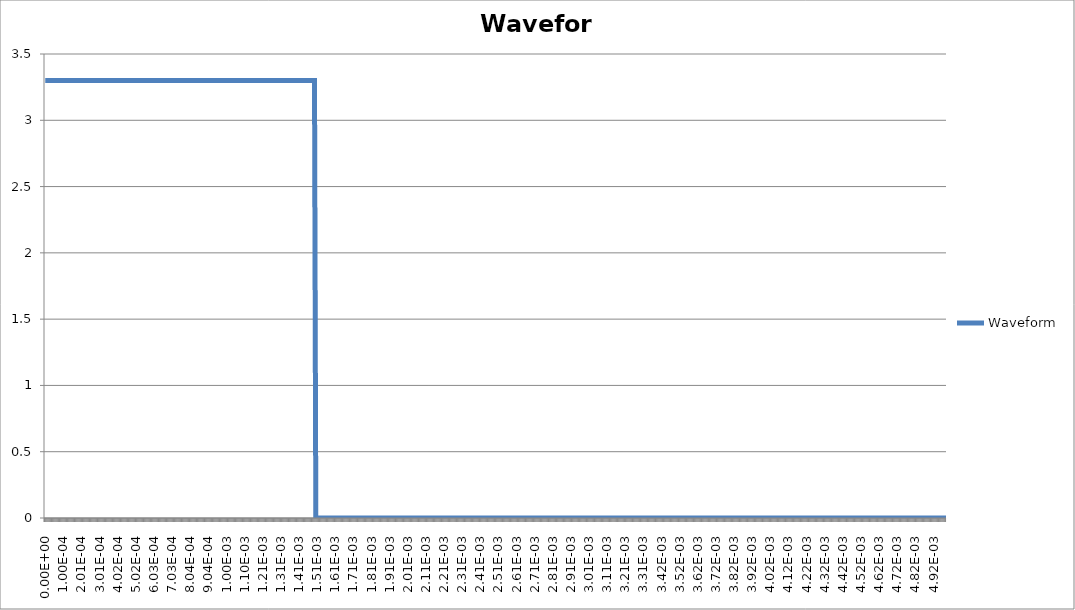
| Category | Waveform |
|---|---|
| 0.0 | 3.3 |
| 2.45e-06 | 3.3 |
| 4.9e-06 | 3.3 |
| 7.35e-06 | 3.3 |
| 9.8e-06 | 3.3 |
| 1.225e-05 | 3.3 |
| 1.47e-05 | 3.3 |
| 1.715e-05 | 3.3 |
| 1.96e-05 | 3.3 |
| 2.205e-05 | 3.3 |
| 2.45e-05 | 3.3 |
| 2.695e-05 | 3.3 |
| 2.94e-05 | 3.3 |
| 3.185e-05 | 3.3 |
| 3.43e-05 | 3.3 |
| 3.675e-05 | 3.3 |
| 3.92e-05 | 3.3 |
| 4.165e-05 | 3.3 |
| 4.41e-05 | 3.3 |
| 4.655e-05 | 3.3 |
| 4.9e-05 | 3.3 |
| 5.145e-05 | 3.3 |
| 5.39e-05 | 3.3 |
| 5.635e-05 | 3.3 |
| 5.88e-05 | 3.3 |
| 6.125e-05 | 3.3 |
| 6.37e-05 | 3.3 |
| 6.615e-05 | 3.3 |
| 6.86e-05 | 3.3 |
| 7.105e-05 | 3.3 |
| 7.35e-05 | 3.3 |
| 7.595e-05 | 3.3 |
| 7.84e-05 | 3.3 |
| 8.085e-05 | 3.3 |
| 8.33e-05 | 3.3 |
| 8.575e-05 | 3.3 |
| 8.82e-05 | 3.3 |
| 9.065e-05 | 3.3 |
| 9.31e-05 | 3.3 |
| 9.555e-05 | 3.3 |
| 9.8e-05 | 3.3 |
| 0.00010045 | 3.3 |
| 0.0001029 | 3.3 |
| 0.00010535 | 3.3 |
| 0.0001078 | 3.3 |
| 0.00011025 | 3.3 |
| 0.0001127 | 3.3 |
| 0.00011515 | 3.3 |
| 0.0001176 | 3.3 |
| 0.00012005 | 3.3 |
| 0.0001225 | 3.3 |
| 0.00012495 | 3.3 |
| 0.0001274 | 3.3 |
| 0.00012985 | 3.3 |
| 0.0001323 | 3.3 |
| 0.00013475 | 3.3 |
| 0.0001372 | 3.3 |
| 0.00013965 | 3.3 |
| 0.0001421 | 3.3 |
| 0.00014455 | 3.3 |
| 0.000147 | 3.3 |
| 0.00014945 | 3.3 |
| 0.0001519 | 3.3 |
| 0.00015435 | 3.3 |
| 0.0001568 | 3.3 |
| 0.00015925 | 3.3 |
| 0.0001617 | 3.3 |
| 0.00016415 | 3.3 |
| 0.0001666 | 3.3 |
| 0.00016905 | 3.3 |
| 0.0001715 | 3.3 |
| 0.00017395 | 3.3 |
| 0.0001764 | 3.3 |
| 0.00017885 | 3.3 |
| 0.0001813 | 3.3 |
| 0.00018375 | 3.3 |
| 0.0001862 | 3.3 |
| 0.00018865 | 3.3 |
| 0.0001911 | 3.3 |
| 0.00019355 | 3.3 |
| 0.000196 | 3.3 |
| 0.00019845 | 3.3 |
| 0.0002009 | 3.3 |
| 0.00020335 | 3.3 |
| 0.0002058 | 3.3 |
| 0.00020825 | 3.3 |
| 0.0002107 | 3.3 |
| 0.00021315 | 3.3 |
| 0.0002156 | 3.3 |
| 0.00021805 | 3.3 |
| 0.0002205 | 3.3 |
| 0.00022295 | 3.3 |
| 0.0002254 | 3.3 |
| 0.00022785 | 3.3 |
| 0.0002303 | 3.3 |
| 0.00023275 | 3.3 |
| 0.0002352 | 3.3 |
| 0.00023765 | 3.3 |
| 0.0002401 | 3.3 |
| 0.00024255 | 3.3 |
| 0.000245 | 3.3 |
| 0.00024745 | 3.3 |
| 0.0002499 | 3.3 |
| 0.00025235 | 3.3 |
| 0.0002548 | 3.3 |
| 0.00025725 | 3.3 |
| 0.0002597 | 3.3 |
| 0.00026215 | 3.3 |
| 0.0002646 | 3.3 |
| 0.00026705 | 3.3 |
| 0.0002695 | 3.3 |
| 0.00027195 | 3.3 |
| 0.0002744 | 3.3 |
| 0.00027685 | 3.3 |
| 0.0002793 | 3.3 |
| 0.00028175 | 3.3 |
| 0.0002842 | 3.3 |
| 0.00028665 | 3.3 |
| 0.0002891 | 3.3 |
| 0.00029155 | 3.3 |
| 0.000294 | 3.3 |
| 0.00029645 | 3.3 |
| 0.0002989 | 3.3 |
| 0.00030135 | 3.3 |
| 0.0003038 | 3.3 |
| 0.00030625 | 3.3 |
| 0.0003087 | 3.3 |
| 0.00031115 | 3.3 |
| 0.0003136 | 3.3 |
| 0.00031605 | 3.3 |
| 0.0003185 | 3.3 |
| 0.00032095 | 3.3 |
| 0.0003234 | 3.3 |
| 0.00032585 | 3.3 |
| 0.0003283 | 3.3 |
| 0.00033075 | 3.3 |
| 0.0003332 | 3.3 |
| 0.00033565 | 3.3 |
| 0.0003381 | 3.3 |
| 0.00034055 | 3.3 |
| 0.000343 | 3.3 |
| 0.00034545 | 3.3 |
| 0.0003479 | 3.3 |
| 0.00035035 | 3.3 |
| 0.0003528 | 3.3 |
| 0.00035525 | 3.3 |
| 0.0003577 | 3.3 |
| 0.00036015 | 3.3 |
| 0.0003626 | 3.3 |
| 0.00036505 | 3.3 |
| 0.0003675 | 3.3 |
| 0.00036995 | 3.3 |
| 0.0003724 | 3.3 |
| 0.00037485 | 3.3 |
| 0.0003773 | 3.3 |
| 0.00037975 | 3.3 |
| 0.0003822 | 3.3 |
| 0.00038465 | 3.3 |
| 0.0003871 | 3.3 |
| 0.00038955 | 3.3 |
| 0.000392 | 3.3 |
| 0.00039445 | 3.3 |
| 0.0003969 | 3.3 |
| 0.00039935 | 3.3 |
| 0.0004018 | 3.3 |
| 0.00040425 | 3.3 |
| 0.0004067 | 3.3 |
| 0.00040915 | 3.3 |
| 0.0004116 | 3.3 |
| 0.00041405 | 3.3 |
| 0.0004165 | 3.3 |
| 0.00041895 | 3.3 |
| 0.0004214 | 3.3 |
| 0.00042385 | 3.3 |
| 0.0004263 | 3.3 |
| 0.00042875 | 3.3 |
| 0.0004312 | 3.3 |
| 0.00043365 | 3.3 |
| 0.0004361 | 3.3 |
| 0.00043855 | 3.3 |
| 0.000441 | 3.3 |
| 0.00044345 | 3.3 |
| 0.0004459 | 3.3 |
| 0.00044835 | 3.3 |
| 0.0004508 | 3.3 |
| 0.00045325 | 3.3 |
| 0.0004557 | 3.3 |
| 0.00045815 | 3.3 |
| 0.0004606 | 3.3 |
| 0.00046305 | 3.3 |
| 0.0004655 | 3.3 |
| 0.00046795 | 3.3 |
| 0.0004704 | 3.3 |
| 0.00047285 | 3.3 |
| 0.0004753 | 3.3 |
| 0.00047775 | 3.3 |
| 0.0004802 | 3.3 |
| 0.00048265 | 3.3 |
| 0.0004851 | 3.3 |
| 0.00048755 | 3.3 |
| 0.00049 | 3.3 |
| 0.00049245 | 3.3 |
| 0.0004949 | 3.3 |
| 0.00049735 | 3.3 |
| 0.0004998 | 3.3 |
| 0.00050225 | 3.3 |
| 0.0005047 | 3.3 |
| 0.00050715 | 3.3 |
| 0.0005096 | 3.3 |
| 0.00051205 | 3.3 |
| 0.0005145 | 3.3 |
| 0.00051695 | 3.3 |
| 0.0005194 | 3.3 |
| 0.00052185 | 3.3 |
| 0.0005243 | 3.3 |
| 0.00052675 | 3.3 |
| 0.0005292 | 3.3 |
| 0.00053165 | 3.3 |
| 0.0005341 | 3.3 |
| 0.00053655 | 3.3 |
| 0.000539 | 3.3 |
| 0.00054145 | 3.3 |
| 0.0005439 | 3.3 |
| 0.00054635 | 3.3 |
| 0.0005488 | 3.3 |
| 0.00055125 | 3.3 |
| 0.0005537 | 3.3 |
| 0.00055615 | 3.3 |
| 0.0005586 | 3.3 |
| 0.00056105 | 3.3 |
| 0.0005635 | 3.3 |
| 0.00056595 | 3.3 |
| 0.0005684 | 3.3 |
| 0.00057085 | 3.3 |
| 0.0005733 | 3.3 |
| 0.00057575 | 3.3 |
| 0.0005782 | 3.3 |
| 0.00058065 | 3.3 |
| 0.0005831 | 3.3 |
| 0.00058555 | 3.3 |
| 0.000588 | 3.3 |
| 0.00059045 | 3.3 |
| 0.0005929 | 3.3 |
| 0.00059535 | 3.3 |
| 0.0005978 | 3.3 |
| 0.00060025 | 3.3 |
| 0.0006027 | 3.3 |
| 0.00060515 | 3.3 |
| 0.0006076 | 3.3 |
| 0.00061005 | 3.3 |
| 0.0006125 | 3.3 |
| 0.00061495 | 3.3 |
| 0.0006174 | 3.3 |
| 0.00061985 | 3.3 |
| 0.0006223 | 3.3 |
| 0.00062475 | 3.3 |
| 0.0006272 | 3.3 |
| 0.00062965 | 3.3 |
| 0.0006321 | 3.3 |
| 0.00063455 | 3.3 |
| 0.000637 | 3.3 |
| 0.00063945 | 3.3 |
| 0.0006419 | 3.3 |
| 0.00064435 | 3.3 |
| 0.0006468 | 3.3 |
| 0.00064925 | 3.3 |
| 0.0006517 | 3.3 |
| 0.00065415 | 3.3 |
| 0.0006566 | 3.3 |
| 0.00065905 | 3.3 |
| 0.0006615 | 3.3 |
| 0.00066395 | 3.3 |
| 0.0006664 | 3.3 |
| 0.00066885 | 3.3 |
| 0.0006713 | 3.3 |
| 0.00067375 | 3.3 |
| 0.0006762 | 3.3 |
| 0.00067865 | 3.3 |
| 0.0006811 | 3.3 |
| 0.00068355 | 3.3 |
| 0.000686 | 3.3 |
| 0.00068845 | 3.3 |
| 0.0006909 | 3.3 |
| 0.00069335 | 3.3 |
| 0.0006958 | 3.3 |
| 0.00069825 | 3.3 |
| 0.0007007 | 3.3 |
| 0.00070315 | 3.3 |
| 0.0007056 | 3.3 |
| 0.00070805 | 3.3 |
| 0.0007105 | 3.3 |
| 0.00071295 | 3.3 |
| 0.0007154 | 3.3 |
| 0.00071785 | 3.3 |
| 0.0007203 | 3.3 |
| 0.00072275 | 3.3 |
| 0.0007252 | 3.3 |
| 0.00072765 | 3.3 |
| 0.0007301 | 3.3 |
| 0.00073255 | 3.3 |
| 0.000735 | 3.3 |
| 0.00073745 | 3.3 |
| 0.0007399 | 3.3 |
| 0.00074235 | 3.3 |
| 0.0007448 | 3.3 |
| 0.00074725 | 3.3 |
| 0.0007497 | 3.3 |
| 0.00075215 | 3.3 |
| 0.0007546 | 3.3 |
| 0.00075705 | 3.3 |
| 0.0007595 | 3.3 |
| 0.00076195 | 3.3 |
| 0.0007644 | 3.3 |
| 0.00076685 | 3.3 |
| 0.0007693 | 3.3 |
| 0.00077175 | 3.3 |
| 0.0007742 | 3.3 |
| 0.00077665 | 3.3 |
| 0.0007791 | 3.3 |
| 0.00078155 | 3.3 |
| 0.000784 | 3.3 |
| 0.00078645 | 3.3 |
| 0.0007889 | 3.3 |
| 0.00079135 | 3.3 |
| 0.0007938 | 3.3 |
| 0.00079625 | 3.3 |
| 0.0007987 | 3.3 |
| 0.00080115 | 3.3 |
| 0.0008036 | 3.3 |
| 0.00080605 | 3.3 |
| 0.0008085 | 3.3 |
| 0.00081095 | 3.3 |
| 0.0008134 | 3.3 |
| 0.00081585 | 3.3 |
| 0.0008183 | 3.3 |
| 0.00082075 | 3.3 |
| 0.0008232 | 3.3 |
| 0.00082565 | 3.3 |
| 0.0008281 | 3.3 |
| 0.00083055 | 3.3 |
| 0.000833 | 3.3 |
| 0.00083545 | 3.3 |
| 0.0008379 | 3.3 |
| 0.00084035 | 3.3 |
| 0.0008428 | 3.3 |
| 0.00084525 | 3.3 |
| 0.0008477 | 3.3 |
| 0.00085015 | 3.3 |
| 0.0008526 | 3.3 |
| 0.00085505 | 3.3 |
| 0.0008575 | 3.3 |
| 0.00085995 | 3.3 |
| 0.0008624 | 3.3 |
| 0.00086485 | 3.3 |
| 0.0008673 | 3.3 |
| 0.00086975 | 3.3 |
| 0.0008722 | 3.3 |
| 0.00087465 | 3.3 |
| 0.0008771 | 3.3 |
| 0.00087955 | 3.3 |
| 0.000882 | 3.3 |
| 0.00088445 | 3.3 |
| 0.0008869 | 3.3 |
| 0.00088935 | 3.3 |
| 0.0008918 | 3.3 |
| 0.00089425 | 3.3 |
| 0.0008967 | 3.3 |
| 0.00089915 | 3.3 |
| 0.0009016 | 3.3 |
| 0.00090405 | 3.3 |
| 0.0009065 | 3.3 |
| 0.00090895 | 3.3 |
| 0.0009114 | 3.3 |
| 0.00091385 | 3.3 |
| 0.0009163 | 3.3 |
| 0.00091875 | 3.3 |
| 0.0009212 | 3.3 |
| 0.00092365 | 3.3 |
| 0.0009261 | 3.3 |
| 0.00092855 | 3.3 |
| 0.000931 | 3.3 |
| 0.00093345 | 3.3 |
| 0.0009359 | 3.3 |
| 0.00093835 | 3.3 |
| 0.0009408 | 3.3 |
| 0.00094325 | 3.3 |
| 0.0009457 | 3.3 |
| 0.00094815 | 3.3 |
| 0.0009506 | 3.3 |
| 0.00095305 | 3.3 |
| 0.0009555 | 3.3 |
| 0.00095795 | 3.3 |
| 0.0009604 | 3.3 |
| 0.00096285 | 3.3 |
| 0.0009653 | 3.3 |
| 0.00096775 | 3.3 |
| 0.0009702 | 3.3 |
| 0.00097265 | 3.3 |
| 0.0009751 | 3.3 |
| 0.00097755 | 3.3 |
| 0.00098 | 3.3 |
| 0.00098245 | 3.3 |
| 0.0009849 | 3.3 |
| 0.00098735 | 3.3 |
| 0.0009898 | 3.3 |
| 0.00099225 | 3.3 |
| 0.0009947 | 3.3 |
| 0.00099715 | 3.3 |
| 0.0009996 | 3.3 |
| 0.00100205 | 3.3 |
| 0.0010045 | 3.3 |
| 0.00100695 | 3.3 |
| 0.0010094 | 3.3 |
| 0.00101185 | 3.3 |
| 0.0010143 | 3.3 |
| 0.00101675 | 3.3 |
| 0.0010192 | 3.3 |
| 0.00102165 | 3.3 |
| 0.0010241 | 3.3 |
| 0.00102655 | 3.3 |
| 0.001029 | 3.3 |
| 0.00103145 | 3.3 |
| 0.0010339 | 3.3 |
| 0.00103635 | 3.3 |
| 0.0010388 | 3.3 |
| 0.00104125 | 3.3 |
| 0.0010437 | 3.3 |
| 0.00104615 | 3.3 |
| 0.0010486 | 3.3 |
| 0.00105105 | 3.3 |
| 0.0010535 | 3.3 |
| 0.00105595 | 3.3 |
| 0.0010584 | 3.3 |
| 0.00106085 | 3.3 |
| 0.0010633 | 3.3 |
| 0.00106575 | 3.3 |
| 0.0010682 | 3.3 |
| 0.00107065 | 3.3 |
| 0.0010731 | 3.3 |
| 0.00107555 | 3.3 |
| 0.001078 | 3.3 |
| 0.00108045 | 3.3 |
| 0.0010829 | 3.3 |
| 0.00108535 | 3.3 |
| 0.0010878 | 3.3 |
| 0.00109025 | 3.3 |
| 0.0010927 | 3.3 |
| 0.00109515 | 3.3 |
| 0.0010976 | 3.3 |
| 0.00110005 | 3.3 |
| 0.0011025 | 3.3 |
| 0.00110495 | 3.3 |
| 0.0011074 | 3.3 |
| 0.00110985 | 3.3 |
| 0.0011123 | 3.3 |
| 0.00111475 | 3.3 |
| 0.0011172 | 3.3 |
| 0.00111965 | 3.3 |
| 0.0011221 | 3.3 |
| 0.00112455 | 3.3 |
| 0.001127 | 3.3 |
| 0.00112945 | 3.3 |
| 0.0011319 | 3.3 |
| 0.00113435 | 3.3 |
| 0.0011368 | 3.3 |
| 0.00113925 | 3.3 |
| 0.0011417 | 3.3 |
| 0.00114415 | 3.3 |
| 0.0011466 | 3.3 |
| 0.00114905 | 3.3 |
| 0.0011515 | 3.3 |
| 0.00115395 | 3.3 |
| 0.0011564 | 3.3 |
| 0.00115885 | 3.3 |
| 0.0011613 | 3.3 |
| 0.00116375 | 3.3 |
| 0.0011662 | 3.3 |
| 0.00116865 | 3.3 |
| 0.0011711 | 3.3 |
| 0.00117355 | 3.3 |
| 0.001176 | 3.3 |
| 0.00117845 | 3.3 |
| 0.0011809 | 3.3 |
| 0.00118335 | 3.3 |
| 0.0011858 | 3.3 |
| 0.00118825 | 3.3 |
| 0.0011907 | 3.3 |
| 0.00119315 | 3.3 |
| 0.0011956 | 3.3 |
| 0.00119805 | 3.3 |
| 0.0012005 | 3.3 |
| 0.00120295 | 3.3 |
| 0.0012054 | 3.3 |
| 0.00120785 | 3.3 |
| 0.0012103 | 3.3 |
| 0.00121275 | 3.3 |
| 0.0012152 | 3.3 |
| 0.00121765 | 3.3 |
| 0.0012201 | 3.3 |
| 0.00122255 | 3.3 |
| 0.001225 | 3.3 |
| 0.00122745 | 3.3 |
| 0.0012299 | 3.3 |
| 0.00123235 | 3.3 |
| 0.0012348 | 3.3 |
| 0.00123725 | 3.3 |
| 0.0012397 | 3.3 |
| 0.00124215 | 3.3 |
| 0.0012446 | 3.3 |
| 0.00124705 | 3.3 |
| 0.0012495 | 3.3 |
| 0.00125195 | 3.3 |
| 0.0012544 | 3.3 |
| 0.00125685 | 3.3 |
| 0.0012593 | 3.3 |
| 0.00126175 | 3.3 |
| 0.0012642 | 3.3 |
| 0.00126665 | 3.3 |
| 0.0012691 | 3.3 |
| 0.00127155 | 3.3 |
| 0.001274 | 3.3 |
| 0.00127645 | 3.3 |
| 0.0012789 | 3.3 |
| 0.00128135 | 3.3 |
| 0.0012838 | 3.3 |
| 0.00128625 | 3.3 |
| 0.0012887 | 3.3 |
| 0.00129115 | 3.3 |
| 0.0012936 | 3.3 |
| 0.00129605 | 3.3 |
| 0.0012985 | 3.3 |
| 0.00130095 | 3.3 |
| 0.0013034 | 3.3 |
| 0.00130585 | 3.3 |
| 0.0013083 | 3.3 |
| 0.00131075 | 3.3 |
| 0.0013132 | 3.3 |
| 0.00131565 | 3.3 |
| 0.0013181 | 3.3 |
| 0.00132055 | 3.3 |
| 0.001323 | 3.3 |
| 0.00132545 | 3.3 |
| 0.0013279 | 3.3 |
| 0.00133035 | 3.3 |
| 0.0013328 | 3.3 |
| 0.00133525 | 3.3 |
| 0.0013377 | 3.3 |
| 0.00134015 | 3.3 |
| 0.0013426 | 3.3 |
| 0.00134505 | 3.3 |
| 0.0013475 | 3.3 |
| 0.00134995 | 3.3 |
| 0.0013524 | 3.3 |
| 0.00135485 | 3.3 |
| 0.0013573 | 3.3 |
| 0.00135975 | 3.3 |
| 0.0013622 | 3.3 |
| 0.00136465 | 3.3 |
| 0.0013671 | 3.3 |
| 0.00136955 | 3.3 |
| 0.001372 | 3.3 |
| 0.00137445 | 3.3 |
| 0.0013769 | 3.3 |
| 0.00137935 | 3.3 |
| 0.0013818 | 3.3 |
| 0.00138425 | 3.3 |
| 0.0013867 | 3.3 |
| 0.00138915 | 3.3 |
| 0.0013916 | 3.3 |
| 0.00139405 | 3.3 |
| 0.0013965 | 3.3 |
| 0.00139895 | 3.3 |
| 0.0014014 | 3.3 |
| 0.00140385 | 3.3 |
| 0.0014063 | 3.3 |
| 0.00140875 | 3.3 |
| 0.0014112 | 3.3 |
| 0.00141365 | 3.3 |
| 0.0014161 | 3.3 |
| 0.00141855 | 3.3 |
| 0.001421 | 3.3 |
| 0.00142345 | 3.3 |
| 0.0014259 | 3.3 |
| 0.00142835 | 3.3 |
| 0.0014308 | 3.3 |
| 0.00143325 | 3.3 |
| 0.0014357 | 3.3 |
| 0.00143815 | 3.3 |
| 0.0014406 | 3.3 |
| 0.00144305 | 3.3 |
| 0.0014455 | 3.3 |
| 0.00144795 | 3.3 |
| 0.0014504 | 3.3 |
| 0.00145285 | 3.3 |
| 0.0014553 | 3.3 |
| 0.00145775 | 3.3 |
| 0.0014602 | 3.3 |
| 0.00146265 | 3.3 |
| 0.0014651 | 3.3 |
| 0.00146755 | 3.3 |
| 0.00147 | 3.3 |
| 0.00147245 | 3.3 |
| 0.0014749 | 3.3 |
| 0.00147735 | 3.3 |
| 0.0014798 | 3.3 |
| 0.00148225 | 3.3 |
| 0.0014847 | 3.3 |
| 0.00148715 | 3.3 |
| 0.0014896 | 3.3 |
| 0.00149205 | 3.3 |
| 0.0014945 | 3.3 |
| 0.00149695 | 3.3 |
| 0.0014994 | 0 |
| 0.00150185 | 0 |
| 0.0015043 | 0 |
| 0.00150675 | 0 |
| 0.0015092 | 0 |
| 0.00151165 | 0 |
| 0.0015141 | 0 |
| 0.00151655 | 0 |
| 0.001519 | 0 |
| 0.00152145 | 0 |
| 0.0015239 | 0 |
| 0.00152635 | 0 |
| 0.0015288 | 0 |
| 0.00153125 | 0 |
| 0.0015337 | 0 |
| 0.00153615 | 0 |
| 0.0015386 | 0 |
| 0.00154105 | 0 |
| 0.0015435 | 0 |
| 0.00154595 | 0 |
| 0.0015484 | 0 |
| 0.00155085 | 0 |
| 0.0015533 | 0 |
| 0.00155575 | 0 |
| 0.0015582 | 0 |
| 0.00156065 | 0 |
| 0.0015631 | 0 |
| 0.00156555 | 0 |
| 0.001568 | 0 |
| 0.00157045 | 0 |
| 0.0015729 | 0 |
| 0.00157535 | 0 |
| 0.0015778 | 0 |
| 0.00158025 | 0 |
| 0.0015827 | 0 |
| 0.00158515 | 0 |
| 0.0015876 | 0 |
| 0.00159005 | 0 |
| 0.0015925 | 0 |
| 0.00159495 | 0 |
| 0.0015974 | 0 |
| 0.00159985 | 0 |
| 0.0016023 | 0 |
| 0.00160475 | 0 |
| 0.0016072 | 0 |
| 0.00160965 | 0 |
| 0.0016121 | 0 |
| 0.00161455 | 0 |
| 0.001617 | 0 |
| 0.00161945 | 0 |
| 0.0016219 | 0 |
| 0.00162435 | 0 |
| 0.0016268 | 0 |
| 0.00162925 | 0 |
| 0.0016317 | 0 |
| 0.00163415 | 0 |
| 0.0016366 | 0 |
| 0.00163905 | 0 |
| 0.0016415 | 0 |
| 0.00164395 | 0 |
| 0.0016464 | 0 |
| 0.00164885 | 0 |
| 0.0016513 | 0 |
| 0.00165375 | 0 |
| 0.0016562 | 0 |
| 0.00165865 | 0 |
| 0.0016611 | 0 |
| 0.00166355 | 0 |
| 0.001666 | 0 |
| 0.00166845 | 0 |
| 0.0016709 | 0 |
| 0.00167335 | 0 |
| 0.0016758 | 0 |
| 0.00167825 | 0 |
| 0.0016807 | 0 |
| 0.00168315 | 0 |
| 0.0016856 | 0 |
| 0.00168805 | 0 |
| 0.0016905 | 0 |
| 0.00169295 | 0 |
| 0.0016954 | 0 |
| 0.00169785 | 0 |
| 0.0017003 | 0 |
| 0.00170275 | 0 |
| 0.0017052 | 0 |
| 0.00170765 | 0 |
| 0.0017101 | 0 |
| 0.00171255 | 0 |
| 0.001715 | 0 |
| 0.00171745 | 0 |
| 0.0017199 | 0 |
| 0.00172235 | 0 |
| 0.0017248 | 0 |
| 0.00172725 | 0 |
| 0.0017297 | 0 |
| 0.00173215 | 0 |
| 0.0017346 | 0 |
| 0.00173705 | 0 |
| 0.0017395 | 0 |
| 0.00174195 | 0 |
| 0.0017444 | 0 |
| 0.00174685 | 0 |
| 0.0017493 | 0 |
| 0.00175175 | 0 |
| 0.0017542 | 0 |
| 0.00175665 | 0 |
| 0.0017591 | 0 |
| 0.00176155 | 0 |
| 0.001764 | 0 |
| 0.00176645 | 0 |
| 0.0017689 | 0 |
| 0.00177135 | 0 |
| 0.0017738 | 0 |
| 0.00177625 | 0 |
| 0.0017787 | 0 |
| 0.00178115 | 0 |
| 0.0017836 | 0 |
| 0.00178605 | 0 |
| 0.0017885 | 0 |
| 0.00179095 | 0 |
| 0.0017934 | 0 |
| 0.00179585 | 0 |
| 0.0017983 | 0 |
| 0.00180075 | 0 |
| 0.0018032 | 0 |
| 0.00180565 | 0 |
| 0.0018081 | 0 |
| 0.00181055 | 0 |
| 0.001813 | 0 |
| 0.00181545 | 0 |
| 0.0018179 | 0 |
| 0.00182035 | 0 |
| 0.0018228 | 0 |
| 0.00182525 | 0 |
| 0.0018277 | 0 |
| 0.00183015 | 0 |
| 0.0018326 | 0 |
| 0.00183505 | 0 |
| 0.0018375 | 0 |
| 0.00183995 | 0 |
| 0.0018424 | 0 |
| 0.00184485 | 0 |
| 0.0018473 | 0 |
| 0.00184975 | 0 |
| 0.0018522 | 0 |
| 0.00185465 | 0 |
| 0.0018571 | 0 |
| 0.00185955 | 0 |
| 0.001862 | 0 |
| 0.00186445 | 0 |
| 0.0018669 | 0 |
| 0.00186935 | 0 |
| 0.0018718 | 0 |
| 0.00187425 | 0 |
| 0.0018767 | 0 |
| 0.00187915 | 0 |
| 0.0018816 | 0 |
| 0.00188405 | 0 |
| 0.0018865 | 0 |
| 0.00188895 | 0 |
| 0.0018914 | 0 |
| 0.00189385 | 0 |
| 0.0018963 | 0 |
| 0.00189875 | 0 |
| 0.0019012 | 0 |
| 0.00190365 | 0 |
| 0.0019061 | 0 |
| 0.00190855 | 0 |
| 0.001911 | 0 |
| 0.00191345 | 0 |
| 0.0019159 | 0 |
| 0.00191835 | 0 |
| 0.0019208 | 0 |
| 0.00192325 | 0 |
| 0.0019257 | 0 |
| 0.00192815 | 0 |
| 0.0019306 | 0 |
| 0.00193305 | 0 |
| 0.0019355 | 0 |
| 0.00193795 | 0 |
| 0.0019404 | 0 |
| 0.00194285 | 0 |
| 0.0019453 | 0 |
| 0.00194775 | 0 |
| 0.0019502 | 0 |
| 0.00195265 | 0 |
| 0.0019551 | 0 |
| 0.00195755 | 0 |
| 0.00196 | 0 |
| 0.00196245 | 0 |
| 0.0019649 | 0 |
| 0.00196735 | 0 |
| 0.0019698 | 0 |
| 0.00197225 | 0 |
| 0.0019747 | 0 |
| 0.00197715 | 0 |
| 0.0019796 | 0 |
| 0.00198205 | 0 |
| 0.0019845 | 0 |
| 0.00198695 | 0 |
| 0.0019894 | 0 |
| 0.00199185 | 0 |
| 0.0019943 | 0 |
| 0.00199675 | 0 |
| 0.0019992 | 0 |
| 0.00200165 | 0 |
| 0.0020041 | 0 |
| 0.00200655 | 0 |
| 0.002009 | 0 |
| 0.00201145 | 0 |
| 0.0020139 | 0 |
| 0.00201635 | 0 |
| 0.0020188 | 0 |
| 0.00202125 | 0 |
| 0.0020237 | 0 |
| 0.00202615 | 0 |
| 0.0020286 | 0 |
| 0.00203105 | 0 |
| 0.0020335 | 0 |
| 0.00203595 | 0 |
| 0.0020384 | 0 |
| 0.00204085 | 0 |
| 0.0020433 | 0 |
| 0.00204575 | 0 |
| 0.0020482 | 0 |
| 0.00205065 | 0 |
| 0.0020531 | 0 |
| 0.00205555 | 0 |
| 0.002058 | 0 |
| 0.00206045 | 0 |
| 0.0020629 | 0 |
| 0.00206535 | 0 |
| 0.0020678 | 0 |
| 0.00207025 | 0 |
| 0.0020727 | 0 |
| 0.00207515 | 0 |
| 0.0020776 | 0 |
| 0.00208005 | 0 |
| 0.0020825 | 0 |
| 0.00208495 | 0 |
| 0.0020874 | 0 |
| 0.00208985 | 0 |
| 0.0020923 | 0 |
| 0.00209475 | 0 |
| 0.0020972 | 0 |
| 0.00209965 | 0 |
| 0.0021021 | 0 |
| 0.00210455 | 0 |
| 0.002107 | 0 |
| 0.00210945 | 0 |
| 0.0021119 | 0 |
| 0.00211435 | 0 |
| 0.0021168 | 0 |
| 0.00211925 | 0 |
| 0.0021217 | 0 |
| 0.00212415 | 0 |
| 0.0021266 | 0 |
| 0.00212905 | 0 |
| 0.0021315 | 0 |
| 0.00213395 | 0 |
| 0.0021364 | 0 |
| 0.00213885 | 0 |
| 0.0021413 | 0 |
| 0.00214375 | 0 |
| 0.0021462 | 0 |
| 0.00214865 | 0 |
| 0.0021511 | 0 |
| 0.00215355 | 0 |
| 0.002156 | 0 |
| 0.00215845 | 0 |
| 0.0021609 | 0 |
| 0.00216335 | 0 |
| 0.0021658 | 0 |
| 0.00216825 | 0 |
| 0.0021707 | 0 |
| 0.00217315 | 0 |
| 0.0021756 | 0 |
| 0.00217805 | 0 |
| 0.0021805 | 0 |
| 0.00218295 | 0 |
| 0.0021854 | 0 |
| 0.00218785 | 0 |
| 0.0021903 | 0 |
| 0.00219275 | 0 |
| 0.0021952 | 0 |
| 0.00219765 | 0 |
| 0.0022001 | 0 |
| 0.00220255 | 0 |
| 0.002205 | 0 |
| 0.00220745 | 0 |
| 0.0022099 | 0 |
| 0.00221235 | 0 |
| 0.0022148 | 0 |
| 0.00221725 | 0 |
| 0.0022197 | 0 |
| 0.00222215 | 0 |
| 0.0022246 | 0 |
| 0.00222705 | 0 |
| 0.0022295 | 0 |
| 0.00223195 | 0 |
| 0.0022344 | 0 |
| 0.00223685 | 0 |
| 0.0022393 | 0 |
| 0.00224175 | 0 |
| 0.0022442 | 0 |
| 0.00224665 | 0 |
| 0.0022491 | 0 |
| 0.00225155 | 0 |
| 0.002254 | 0 |
| 0.00225645 | 0 |
| 0.0022589 | 0 |
| 0.00226135 | 0 |
| 0.0022638 | 0 |
| 0.00226625 | 0 |
| 0.0022687 | 0 |
| 0.00227115 | 0 |
| 0.0022736 | 0 |
| 0.00227605 | 0 |
| 0.0022785 | 0 |
| 0.00228095 | 0 |
| 0.0022834 | 0 |
| 0.00228585 | 0 |
| 0.0022883 | 0 |
| 0.00229075 | 0 |
| 0.0022932 | 0 |
| 0.00229565 | 0 |
| 0.0022981 | 0 |
| 0.00230055 | 0 |
| 0.002303 | 0 |
| 0.00230545 | 0 |
| 0.0023079 | 0 |
| 0.00231035 | 0 |
| 0.0023128 | 0 |
| 0.00231525 | 0 |
| 0.0023177 | 0 |
| 0.00232015 | 0 |
| 0.0023226 | 0 |
| 0.00232505 | 0 |
| 0.0023275 | 0 |
| 0.00232995 | 0 |
| 0.0023324 | 0 |
| 0.00233485 | 0 |
| 0.0023373 | 0 |
| 0.00233975 | 0 |
| 0.0023422 | 0 |
| 0.00234465 | 0 |
| 0.0023471 | 0 |
| 0.00234955 | 0 |
| 0.002352 | 0 |
| 0.00235445 | 0 |
| 0.0023569 | 0 |
| 0.00235935 | 0 |
| 0.0023618 | 0 |
| 0.00236425 | 0 |
| 0.0023667 | 0 |
| 0.00236915 | 0 |
| 0.0023716 | 0 |
| 0.00237405 | 0 |
| 0.0023765 | 0 |
| 0.00237895 | 0 |
| 0.0023814 | 0 |
| 0.00238385 | 0 |
| 0.0023863 | 0 |
| 0.00238875 | 0 |
| 0.0023912 | 0 |
| 0.00239365 | 0 |
| 0.0023961 | 0 |
| 0.00239855 | 0 |
| 0.002401 | 0 |
| 0.00240345 | 0 |
| 0.0024059 | 0 |
| 0.00240835 | 0 |
| 0.0024108 | 0 |
| 0.00241325 | 0 |
| 0.0024157 | 0 |
| 0.00241815 | 0 |
| 0.0024206 | 0 |
| 0.00242305 | 0 |
| 0.0024255 | 0 |
| 0.00242795 | 0 |
| 0.0024304 | 0 |
| 0.00243285 | 0 |
| 0.0024353 | 0 |
| 0.00243775 | 0 |
| 0.0024402 | 0 |
| 0.00244265 | 0 |
| 0.0024451 | 0 |
| 0.00244755 | 0 |
| 0.00245 | 0 |
| 0.00245245 | 0 |
| 0.0024549 | 0 |
| 0.00245735 | 0 |
| 0.0024598 | 0 |
| 0.00246225 | 0 |
| 0.0024647 | 0 |
| 0.00246715 | 0 |
| 0.0024696 | 0 |
| 0.00247205 | 0 |
| 0.0024745 | 0 |
| 0.00247695 | 0 |
| 0.0024794 | 0 |
| 0.00248185 | 0 |
| 0.0024843 | 0 |
| 0.00248675 | 0 |
| 0.0024892 | 0 |
| 0.00249165 | 0 |
| 0.0024941 | 0 |
| 0.00249655 | 0 |
| 0.002499 | 0 |
| 0.00250145 | 0 |
| 0.0025039 | 0 |
| 0.00250635 | 0 |
| 0.0025088 | 0 |
| 0.00251125 | 0 |
| 0.0025137 | 0 |
| 0.00251615 | 0 |
| 0.0025186 | 0 |
| 0.00252105 | 0 |
| 0.0025235 | 0 |
| 0.00252595 | 0 |
| 0.0025284 | 0 |
| 0.00253085 | 0 |
| 0.0025333 | 0 |
| 0.00253575 | 0 |
| 0.0025382 | 0 |
| 0.00254065 | 0 |
| 0.0025431 | 0 |
| 0.00254555 | 0 |
| 0.002548 | 0 |
| 0.00255045 | 0 |
| 0.0025529 | 0 |
| 0.00255535 | 0 |
| 0.0025578 | 0 |
| 0.00256025 | 0 |
| 0.0025627 | 0 |
| 0.00256515 | 0 |
| 0.0025676 | 0 |
| 0.00257005 | 0 |
| 0.0025725 | 0 |
| 0.00257495 | 0 |
| 0.0025774 | 0 |
| 0.00257985 | 0 |
| 0.0025823 | 0 |
| 0.00258475 | 0 |
| 0.0025872 | 0 |
| 0.00258965 | 0 |
| 0.0025921 | 0 |
| 0.00259455 | 0 |
| 0.002597 | 0 |
| 0.00259945 | 0 |
| 0.0026019 | 0 |
| 0.00260435 | 0 |
| 0.0026068 | 0 |
| 0.00260925 | 0 |
| 0.0026117 | 0 |
| 0.00261415 | 0 |
| 0.0026166 | 0 |
| 0.00261905 | 0 |
| 0.0026215 | 0 |
| 0.00262395 | 0 |
| 0.0026264 | 0 |
| 0.00262885 | 0 |
| 0.0026313 | 0 |
| 0.00263375 | 0 |
| 0.0026362 | 0 |
| 0.00263865 | 0 |
| 0.0026411 | 0 |
| 0.00264355 | 0 |
| 0.002646 | 0 |
| 0.00264845 | 0 |
| 0.0026509 | 0 |
| 0.00265335 | 0 |
| 0.0026558 | 0 |
| 0.00265825 | 0 |
| 0.0026607 | 0 |
| 0.00266315 | 0 |
| 0.0026656 | 0 |
| 0.00266805 | 0 |
| 0.0026705 | 0 |
| 0.00267295 | 0 |
| 0.0026754 | 0 |
| 0.00267785 | 0 |
| 0.0026803 | 0 |
| 0.00268275 | 0 |
| 0.0026852 | 0 |
| 0.00268765 | 0 |
| 0.0026901 | 0 |
| 0.00269255 | 0 |
| 0.002695 | 0 |
| 0.00269745 | 0 |
| 0.0026999 | 0 |
| 0.00270235 | 0 |
| 0.0027048 | 0 |
| 0.00270725 | 0 |
| 0.0027097 | 0 |
| 0.00271215 | 0 |
| 0.0027146 | 0 |
| 0.00271705 | 0 |
| 0.0027195 | 0 |
| 0.00272195 | 0 |
| 0.0027244 | 0 |
| 0.00272685 | 0 |
| 0.0027293 | 0 |
| 0.00273175 | 0 |
| 0.0027342 | 0 |
| 0.00273665 | 0 |
| 0.0027391 | 0 |
| 0.00274155 | 0 |
| 0.002744 | 0 |
| 0.00274645 | 0 |
| 0.0027489 | 0 |
| 0.00275135 | 0 |
| 0.0027538 | 0 |
| 0.00275625 | 0 |
| 0.0027587 | 0 |
| 0.00276115 | 0 |
| 0.0027636 | 0 |
| 0.00276605 | 0 |
| 0.0027685 | 0 |
| 0.00277095 | 0 |
| 0.0027734 | 0 |
| 0.00277585 | 0 |
| 0.0027783 | 0 |
| 0.00278075 | 0 |
| 0.0027832 | 0 |
| 0.00278565 | 0 |
| 0.0027881 | 0 |
| 0.00279055 | 0 |
| 0.002793 | 0 |
| 0.00279545 | 0 |
| 0.0027979 | 0 |
| 0.00280035 | 0 |
| 0.0028028 | 0 |
| 0.00280525 | 0 |
| 0.0028077 | 0 |
| 0.00281015 | 0 |
| 0.0028126 | 0 |
| 0.00281505 | 0 |
| 0.0028175 | 0 |
| 0.00281995 | 0 |
| 0.0028224 | 0 |
| 0.00282485 | 0 |
| 0.0028273 | 0 |
| 0.00282975 | 0 |
| 0.0028322 | 0 |
| 0.00283465 | 0 |
| 0.0028371 | 0 |
| 0.00283955 | 0 |
| 0.002842 | 0 |
| 0.00284445 | 0 |
| 0.0028469 | 0 |
| 0.00284935 | 0 |
| 0.0028518 | 0 |
| 0.00285425 | 0 |
| 0.0028567 | 0 |
| 0.00285915 | 0 |
| 0.0028616 | 0 |
| 0.00286405 | 0 |
| 0.0028665 | 0 |
| 0.00286895 | 0 |
| 0.0028714 | 0 |
| 0.00287385 | 0 |
| 0.0028763 | 0 |
| 0.00287875 | 0 |
| 0.0028812 | 0 |
| 0.00288365 | 0 |
| 0.0028861 | 0 |
| 0.00288855 | 0 |
| 0.002891 | 0 |
| 0.00289345 | 0 |
| 0.0028959 | 0 |
| 0.00289835 | 0 |
| 0.0029008 | 0 |
| 0.00290325 | 0 |
| 0.0029057 | 0 |
| 0.00290815 | 0 |
| 0.0029106 | 0 |
| 0.00291305 | 0 |
| 0.0029155 | 0 |
| 0.00291795 | 0 |
| 0.0029204 | 0 |
| 0.00292285 | 0 |
| 0.0029253 | 0 |
| 0.00292775 | 0 |
| 0.0029302 | 0 |
| 0.00293265 | 0 |
| 0.0029351 | 0 |
| 0.00293755 | 0 |
| 0.00294 | 0 |
| 0.00294245 | 0 |
| 0.0029449 | 0 |
| 0.00294735 | 0 |
| 0.0029498 | 0 |
| 0.00295225 | 0 |
| 0.0029547 | 0 |
| 0.00295715 | 0 |
| 0.0029596 | 0 |
| 0.00296205 | 0 |
| 0.0029645 | 0 |
| 0.00296695 | 0 |
| 0.0029694 | 0 |
| 0.00297185 | 0 |
| 0.0029743 | 0 |
| 0.00297675 | 0 |
| 0.0029792 | 0 |
| 0.00298165 | 0 |
| 0.0029841 | 0 |
| 0.00298655 | 0 |
| 0.002989 | 0 |
| 0.00299145 | 0 |
| 0.0029939 | 0 |
| 0.00299635 | 0 |
| 0.0029988 | 0 |
| 0.00300125 | 0 |
| 0.0030037 | 0 |
| 0.00300615 | 0 |
| 0.0030086 | 0 |
| 0.00301105 | 0 |
| 0.0030135 | 0 |
| 0.00301595 | 0 |
| 0.0030184 | 0 |
| 0.00302085 | 0 |
| 0.0030233 | 0 |
| 0.00302575 | 0 |
| 0.0030282 | 0 |
| 0.00303065 | 0 |
| 0.0030331 | 0 |
| 0.00303555 | 0 |
| 0.003038 | 0 |
| 0.00304045 | 0 |
| 0.0030429 | 0 |
| 0.00304535 | 0 |
| 0.0030478 | 0 |
| 0.00305025 | 0 |
| 0.0030527 | 0 |
| 0.00305515 | 0 |
| 0.0030576 | 0 |
| 0.00306005 | 0 |
| 0.0030625 | 0 |
| 0.00306495 | 0 |
| 0.0030674 | 0 |
| 0.00306985 | 0 |
| 0.0030723 | 0 |
| 0.00307475 | 0 |
| 0.0030772 | 0 |
| 0.00307965 | 0 |
| 0.0030821 | 0 |
| 0.00308455 | 0 |
| 0.003087 | 0 |
| 0.00308945 | 0 |
| 0.0030919 | 0 |
| 0.00309435 | 0 |
| 0.0030968 | 0 |
| 0.00309925 | 0 |
| 0.0031017 | 0 |
| 0.00310415 | 0 |
| 0.0031066 | 0 |
| 0.00310905 | 0 |
| 0.0031115 | 0 |
| 0.00311395 | 0 |
| 0.0031164 | 0 |
| 0.00311885 | 0 |
| 0.0031213 | 0 |
| 0.00312375 | 0 |
| 0.0031262 | 0 |
| 0.00312865 | 0 |
| 0.0031311 | 0 |
| 0.00313355 | 0 |
| 0.003136 | 0 |
| 0.00313845 | 0 |
| 0.0031409 | 0 |
| 0.00314335 | 0 |
| 0.0031458 | 0 |
| 0.00314825 | 0 |
| 0.0031507 | 0 |
| 0.00315315 | 0 |
| 0.0031556 | 0 |
| 0.00315805 | 0 |
| 0.0031605 | 0 |
| 0.00316295 | 0 |
| 0.0031654 | 0 |
| 0.00316785 | 0 |
| 0.0031703 | 0 |
| 0.00317275 | 0 |
| 0.0031752 | 0 |
| 0.00317765 | 0 |
| 0.0031801 | 0 |
| 0.00318255 | 0 |
| 0.003185 | 0 |
| 0.00318745 | 0 |
| 0.0031899 | 0 |
| 0.00319235 | 0 |
| 0.0031948 | 0 |
| 0.00319725 | 0 |
| 0.0031997 | 0 |
| 0.00320215 | 0 |
| 0.0032046 | 0 |
| 0.00320705 | 0 |
| 0.0032095 | 0 |
| 0.00321195 | 0 |
| 0.0032144 | 0 |
| 0.00321685 | 0 |
| 0.0032193 | 0 |
| 0.00322175 | 0 |
| 0.0032242 | 0 |
| 0.00322665 | 0 |
| 0.0032291 | 0 |
| 0.00323155 | 0 |
| 0.003234 | 0 |
| 0.00323645 | 0 |
| 0.0032389 | 0 |
| 0.00324135 | 0 |
| 0.0032438 | 0 |
| 0.00324625 | 0 |
| 0.0032487 | 0 |
| 0.00325115 | 0 |
| 0.0032536 | 0 |
| 0.00325605 | 0 |
| 0.0032585 | 0 |
| 0.00326095 | 0 |
| 0.0032634 | 0 |
| 0.00326585 | 0 |
| 0.0032683 | 0 |
| 0.00327075 | 0 |
| 0.0032732 | 0 |
| 0.00327565 | 0 |
| 0.0032781 | 0 |
| 0.00328055 | 0 |
| 0.003283 | 0 |
| 0.00328545 | 0 |
| 0.0032879 | 0 |
| 0.00329035 | 0 |
| 0.0032928 | 0 |
| 0.00329525 | 0 |
| 0.0032977 | 0 |
| 0.00330015 | 0 |
| 0.0033026 | 0 |
| 0.00330505 | 0 |
| 0.0033075 | 0 |
| 0.00330995 | 0 |
| 0.0033124 | 0 |
| 0.00331485 | 0 |
| 0.0033173 | 0 |
| 0.00331975 | 0 |
| 0.0033222 | 0 |
| 0.00332465 | 0 |
| 0.0033271 | 0 |
| 0.00332955 | 0 |
| 0.003332 | 0 |
| 0.00333445 | 0 |
| 0.0033369 | 0 |
| 0.00333935 | 0 |
| 0.0033418 | 0 |
| 0.00334425 | 0 |
| 0.0033467 | 0 |
| 0.00334915 | 0 |
| 0.0033516 | 0 |
| 0.00335405 | 0 |
| 0.0033565 | 0 |
| 0.00335895 | 0 |
| 0.0033614 | 0 |
| 0.00336385 | 0 |
| 0.0033663 | 0 |
| 0.00336875 | 0 |
| 0.0033712 | 0 |
| 0.00337365 | 0 |
| 0.0033761 | 0 |
| 0.00337855 | 0 |
| 0.003381 | 0 |
| 0.00338345 | 0 |
| 0.0033859 | 0 |
| 0.00338835 | 0 |
| 0.0033908 | 0 |
| 0.00339325 | 0 |
| 0.0033957 | 0 |
| 0.00339815 | 0 |
| 0.0034006 | 0 |
| 0.00340305 | 0 |
| 0.0034055 | 0 |
| 0.00340795 | 0 |
| 0.0034104 | 0 |
| 0.00341285 | 0 |
| 0.0034153 | 0 |
| 0.00341775 | 0 |
| 0.0034202 | 0 |
| 0.00342265 | 0 |
| 0.0034251 | 0 |
| 0.00342755 | 0 |
| 0.00343 | 0 |
| 0.00343245 | 0 |
| 0.0034349 | 0 |
| 0.00343735 | 0 |
| 0.0034398 | 0 |
| 0.00344225 | 0 |
| 0.0034447 | 0 |
| 0.00344715 | 0 |
| 0.0034496 | 0 |
| 0.00345205 | 0 |
| 0.0034545 | 0 |
| 0.00345695 | 0 |
| 0.0034594 | 0 |
| 0.00346185 | 0 |
| 0.0034643 | 0 |
| 0.00346675 | 0 |
| 0.0034692 | 0 |
| 0.00347165 | 0 |
| 0.0034741 | 0 |
| 0.00347655 | 0 |
| 0.003479 | 0 |
| 0.00348145 | 0 |
| 0.0034839 | 0 |
| 0.00348635 | 0 |
| 0.0034888 | 0 |
| 0.00349125 | 0 |
| 0.0034937 | 0 |
| 0.00349615 | 0 |
| 0.0034986 | 0 |
| 0.00350105 | 0 |
| 0.0035035 | 0 |
| 0.00350595 | 0 |
| 0.0035084 | 0 |
| 0.00351085 | 0 |
| 0.0035133 | 0 |
| 0.00351575 | 0 |
| 0.0035182 | 0 |
| 0.00352065 | 0 |
| 0.0035231 | 0 |
| 0.00352555 | 0 |
| 0.003528 | 0 |
| 0.00353045 | 0 |
| 0.0035329 | 0 |
| 0.00353535 | 0 |
| 0.0035378 | 0 |
| 0.00354025 | 0 |
| 0.0035427 | 0 |
| 0.00354515 | 0 |
| 0.0035476 | 0 |
| 0.00355005 | 0 |
| 0.0035525 | 0 |
| 0.00355495 | 0 |
| 0.0035574 | 0 |
| 0.00355985 | 0 |
| 0.0035623 | 0 |
| 0.00356475 | 0 |
| 0.0035672 | 0 |
| 0.00356965 | 0 |
| 0.0035721 | 0 |
| 0.00357455 | 0 |
| 0.003577 | 0 |
| 0.00357945 | 0 |
| 0.0035819 | 0 |
| 0.00358435 | 0 |
| 0.0035868 | 0 |
| 0.00358925 | 0 |
| 0.0035917 | 0 |
| 0.00359415 | 0 |
| 0.0035966 | 0 |
| 0.00359905 | 0 |
| 0.0036015 | 0 |
| 0.00360395 | 0 |
| 0.0036064 | 0 |
| 0.00360885 | 0 |
| 0.0036113 | 0 |
| 0.00361375 | 0 |
| 0.0036162 | 0 |
| 0.00361865 | 0 |
| 0.0036211 | 0 |
| 0.00362355 | 0 |
| 0.003626 | 0 |
| 0.00362845 | 0 |
| 0.0036309 | 0 |
| 0.00363335 | 0 |
| 0.0036358 | 0 |
| 0.00363825 | 0 |
| 0.0036407 | 0 |
| 0.00364315 | 0 |
| 0.0036456 | 0 |
| 0.00364805 | 0 |
| 0.0036505 | 0 |
| 0.00365295 | 0 |
| 0.0036554 | 0 |
| 0.00365785 | 0 |
| 0.0036603 | 0 |
| 0.00366275 | 0 |
| 0.0036652 | 0 |
| 0.00366765 | 0 |
| 0.0036701 | 0 |
| 0.00367255 | 0 |
| 0.003675 | 0 |
| 0.00367745 | 0 |
| 0.0036799 | 0 |
| 0.00368235 | 0 |
| 0.0036848 | 0 |
| 0.00368725 | 0 |
| 0.0036897 | 0 |
| 0.00369215 | 0 |
| 0.0036946 | 0 |
| 0.00369705 | 0 |
| 0.0036995 | 0 |
| 0.00370195 | 0 |
| 0.0037044 | 0 |
| 0.00370685 | 0 |
| 0.0037093 | 0 |
| 0.00371175 | 0 |
| 0.0037142 | 0 |
| 0.00371665 | 0 |
| 0.0037191 | 0 |
| 0.00372155 | 0 |
| 0.003724 | 0 |
| 0.00372645 | 0 |
| 0.0037289 | 0 |
| 0.00373135 | 0 |
| 0.0037338 | 0 |
| 0.00373625 | 0 |
| 0.0037387 | 0 |
| 0.00374115 | 0 |
| 0.0037436 | 0 |
| 0.00374605 | 0 |
| 0.0037485 | 0 |
| 0.00375095 | 0 |
| 0.0037534 | 0 |
| 0.00375585 | 0 |
| 0.0037583 | 0 |
| 0.00376075 | 0 |
| 0.0037632 | 0 |
| 0.00376565 | 0 |
| 0.0037681 | 0 |
| 0.00377055 | 0 |
| 0.003773 | 0 |
| 0.00377545 | 0 |
| 0.0037779 | 0 |
| 0.00378035 | 0 |
| 0.0037828 | 0 |
| 0.00378525 | 0 |
| 0.0037877 | 0 |
| 0.00379015 | 0 |
| 0.0037926 | 0 |
| 0.00379505 | 0 |
| 0.0037975 | 0 |
| 0.00379995 | 0 |
| 0.0038024 | 0 |
| 0.00380485 | 0 |
| 0.0038073 | 0 |
| 0.00380975 | 0 |
| 0.0038122 | 0 |
| 0.00381465 | 0 |
| 0.0038171 | 0 |
| 0.00381955 | 0 |
| 0.003822 | 0 |
| 0.00382445 | 0 |
| 0.0038269 | 0 |
| 0.00382935 | 0 |
| 0.0038318 | 0 |
| 0.00383425 | 0 |
| 0.0038367 | 0 |
| 0.00383915 | 0 |
| 0.0038416 | 0 |
| 0.00384405 | 0 |
| 0.0038465 | 0 |
| 0.00384895 | 0 |
| 0.0038514 | 0 |
| 0.00385385 | 0 |
| 0.0038563 | 0 |
| 0.00385875 | 0 |
| 0.0038612 | 0 |
| 0.00386365 | 0 |
| 0.0038661 | 0 |
| 0.00386855 | 0 |
| 0.003871 | 0 |
| 0.00387345 | 0 |
| 0.0038759 | 0 |
| 0.00387835 | 0 |
| 0.0038808 | 0 |
| 0.00388325 | 0 |
| 0.0038857 | 0 |
| 0.00388815 | 0 |
| 0.0038906 | 0 |
| 0.00389305 | 0 |
| 0.0038955 | 0 |
| 0.00389795 | 0 |
| 0.0039004 | 0 |
| 0.00390285 | 0 |
| 0.0039053 | 0 |
| 0.00390775 | 0 |
| 0.0039102 | 0 |
| 0.00391265 | 0 |
| 0.0039151 | 0 |
| 0.00391755 | 0 |
| 0.00392 | 0 |
| 0.00392245 | 0 |
| 0.0039249 | 0 |
| 0.00392735 | 0 |
| 0.0039298 | 0 |
| 0.00393225 | 0 |
| 0.0039347 | 0 |
| 0.00393715 | 0 |
| 0.0039396 | 0 |
| 0.00394205 | 0 |
| 0.0039445 | 0 |
| 0.00394695 | 0 |
| 0.0039494 | 0 |
| 0.00395185 | 0 |
| 0.0039543 | 0 |
| 0.00395675 | 0 |
| 0.0039592 | 0 |
| 0.00396165 | 0 |
| 0.0039641 | 0 |
| 0.00396655 | 0 |
| 0.003969 | 0 |
| 0.00397145 | 0 |
| 0.0039739 | 0 |
| 0.00397635 | 0 |
| 0.0039788 | 0 |
| 0.00398125 | 0 |
| 0.0039837 | 0 |
| 0.00398615 | 0 |
| 0.0039886 | 0 |
| 0.00399105 | 0 |
| 0.0039935 | 0 |
| 0.00399595 | 0 |
| 0.0039984 | 0 |
| 0.00400085 | 0 |
| 0.0040033 | 0 |
| 0.00400575 | 0 |
| 0.0040082 | 0 |
| 0.00401065 | 0 |
| 0.0040131 | 0 |
| 0.00401555 | 0 |
| 0.004018 | 0 |
| 0.00402045 | 0 |
| 0.0040229 | 0 |
| 0.00402535 | 0 |
| 0.0040278 | 0 |
| 0.00403025 | 0 |
| 0.0040327 | 0 |
| 0.00403515 | 0 |
| 0.0040376 | 0 |
| 0.00404005 | 0 |
| 0.0040425 | 0 |
| 0.00404495 | 0 |
| 0.0040474 | 0 |
| 0.00404985 | 0 |
| 0.0040523 | 0 |
| 0.00405475 | 0 |
| 0.0040572 | 0 |
| 0.00405965 | 0 |
| 0.0040621 | 0 |
| 0.00406455 | 0 |
| 0.004067 | 0 |
| 0.00406945 | 0 |
| 0.0040719 | 0 |
| 0.00407435 | 0 |
| 0.0040768 | 0 |
| 0.00407925 | 0 |
| 0.0040817 | 0 |
| 0.00408415 | 0 |
| 0.0040866 | 0 |
| 0.00408905 | 0 |
| 0.0040915 | 0 |
| 0.00409395 | 0 |
| 0.0040964 | 0 |
| 0.00409885 | 0 |
| 0.0041013 | 0 |
| 0.00410375 | 0 |
| 0.0041062 | 0 |
| 0.00410865 | 0 |
| 0.0041111 | 0 |
| 0.00411355 | 0 |
| 0.004116 | 0 |
| 0.00411845 | 0 |
| 0.0041209 | 0 |
| 0.00412335 | 0 |
| 0.0041258 | 0 |
| 0.00412825 | 0 |
| 0.0041307 | 0 |
| 0.00413315 | 0 |
| 0.0041356 | 0 |
| 0.00413805 | 0 |
| 0.0041405 | 0 |
| 0.00414295 | 0 |
| 0.0041454 | 0 |
| 0.00414785 | 0 |
| 0.0041503 | 0 |
| 0.00415275 | 0 |
| 0.0041552 | 0 |
| 0.00415765 | 0 |
| 0.0041601 | 0 |
| 0.00416255 | 0 |
| 0.004165 | 0 |
| 0.00416745 | 0 |
| 0.0041699 | 0 |
| 0.00417235 | 0 |
| 0.0041748 | 0 |
| 0.00417725 | 0 |
| 0.0041797 | 0 |
| 0.00418215 | 0 |
| 0.0041846 | 0 |
| 0.00418705 | 0 |
| 0.0041895 | 0 |
| 0.00419195 | 0 |
| 0.0041944 | 0 |
| 0.00419685 | 0 |
| 0.0041993 | 0 |
| 0.00420175 | 0 |
| 0.0042042 | 0 |
| 0.00420665 | 0 |
| 0.0042091 | 0 |
| 0.00421155 | 0 |
| 0.004214 | 0 |
| 0.00421645 | 0 |
| 0.0042189 | 0 |
| 0.00422135 | 0 |
| 0.0042238 | 0 |
| 0.00422625 | 0 |
| 0.0042287 | 0 |
| 0.00423115 | 0 |
| 0.0042336 | 0 |
| 0.00423605 | 0 |
| 0.0042385 | 0 |
| 0.00424095 | 0 |
| 0.0042434 | 0 |
| 0.00424585 | 0 |
| 0.0042483 | 0 |
| 0.00425075 | 0 |
| 0.0042532 | 0 |
| 0.00425565 | 0 |
| 0.0042581 | 0 |
| 0.00426055 | 0 |
| 0.004263 | 0 |
| 0.00426545 | 0 |
| 0.0042679 | 0 |
| 0.00427035 | 0 |
| 0.0042728 | 0 |
| 0.00427525 | 0 |
| 0.0042777 | 0 |
| 0.00428015 | 0 |
| 0.0042826 | 0 |
| 0.00428505 | 0 |
| 0.0042875 | 0 |
| 0.00428995 | 0 |
| 0.0042924 | 0 |
| 0.00429485 | 0 |
| 0.0042973 | 0 |
| 0.00429975 | 0 |
| 0.0043022 | 0 |
| 0.00430465 | 0 |
| 0.0043071 | 0 |
| 0.00430955 | 0 |
| 0.004312 | 0 |
| 0.00431445 | 0 |
| 0.0043169 | 0 |
| 0.00431935 | 0 |
| 0.0043218 | 0 |
| 0.00432425 | 0 |
| 0.0043267 | 0 |
| 0.00432915 | 0 |
| 0.0043316 | 0 |
| 0.00433405 | 0 |
| 0.0043365 | 0 |
| 0.00433895 | 0 |
| 0.0043414 | 0 |
| 0.00434385 | 0 |
| 0.0043463 | 0 |
| 0.00434875 | 0 |
| 0.0043512 | 0 |
| 0.00435365 | 0 |
| 0.0043561 | 0 |
| 0.00435855 | 0 |
| 0.004361 | 0 |
| 0.00436345 | 0 |
| 0.0043659 | 0 |
| 0.00436835 | 0 |
| 0.0043708 | 0 |
| 0.00437325 | 0 |
| 0.0043757 | 0 |
| 0.00437815 | 0 |
| 0.0043806 | 0 |
| 0.00438305 | 0 |
| 0.0043855 | 0 |
| 0.00438795 | 0 |
| 0.0043904 | 0 |
| 0.00439285 | 0 |
| 0.0043953 | 0 |
| 0.00439775 | 0 |
| 0.0044002 | 0 |
| 0.00440265 | 0 |
| 0.0044051 | 0 |
| 0.00440755 | 0 |
| 0.00441 | 0 |
| 0.00441245 | 0 |
| 0.0044149 | 0 |
| 0.00441735 | 0 |
| 0.0044198 | 0 |
| 0.00442225 | 0 |
| 0.0044247 | 0 |
| 0.00442715 | 0 |
| 0.0044296 | 0 |
| 0.00443205 | 0 |
| 0.0044345 | 0 |
| 0.00443695 | 0 |
| 0.0044394 | 0 |
| 0.00444185 | 0 |
| 0.0044443 | 0 |
| 0.00444675 | 0 |
| 0.0044492 | 0 |
| 0.00445165 | 0 |
| 0.0044541 | 0 |
| 0.00445655 | 0 |
| 0.004459 | 0 |
| 0.00446145 | 0 |
| 0.0044639 | 0 |
| 0.00446635 | 0 |
| 0.0044688 | 0 |
| 0.00447125 | 0 |
| 0.0044737 | 0 |
| 0.00447615 | 0 |
| 0.0044786 | 0 |
| 0.00448105 | 0 |
| 0.0044835 | 0 |
| 0.00448595 | 0 |
| 0.0044884 | 0 |
| 0.00449085 | 0 |
| 0.0044933 | 0 |
| 0.00449575 | 0 |
| 0.0044982 | 0 |
| 0.00450065 | 0 |
| 0.0045031 | 0 |
| 0.00450555 | 0 |
| 0.004508 | 0 |
| 0.00451045 | 0 |
| 0.0045129 | 0 |
| 0.00451535 | 0 |
| 0.0045178 | 0 |
| 0.00452025 | 0 |
| 0.0045227 | 0 |
| 0.00452515 | 0 |
| 0.0045276 | 0 |
| 0.00453005 | 0 |
| 0.0045325 | 0 |
| 0.00453495 | 0 |
| 0.0045374 | 0 |
| 0.00453985 | 0 |
| 0.0045423 | 0 |
| 0.00454475 | 0 |
| 0.0045472 | 0 |
| 0.00454965 | 0 |
| 0.0045521 | 0 |
| 0.00455455 | 0 |
| 0.004557 | 0 |
| 0.00455945 | 0 |
| 0.0045619 | 0 |
| 0.00456435 | 0 |
| 0.0045668 | 0 |
| 0.00456925 | 0 |
| 0.0045717 | 0 |
| 0.00457415 | 0 |
| 0.0045766 | 0 |
| 0.00457905 | 0 |
| 0.0045815 | 0 |
| 0.00458395 | 0 |
| 0.0045864 | 0 |
| 0.00458885 | 0 |
| 0.0045913 | 0 |
| 0.00459375 | 0 |
| 0.0045962 | 0 |
| 0.00459865 | 0 |
| 0.0046011 | 0 |
| 0.00460355 | 0 |
| 0.004606 | 0 |
| 0.00460845 | 0 |
| 0.0046109 | 0 |
| 0.00461335 | 0 |
| 0.0046158 | 0 |
| 0.00461825 | 0 |
| 0.0046207 | 0 |
| 0.00462315 | 0 |
| 0.0046256 | 0 |
| 0.00462805 | 0 |
| 0.0046305 | 0 |
| 0.00463295 | 0 |
| 0.0046354 | 0 |
| 0.00463785 | 0 |
| 0.0046403 | 0 |
| 0.00464275 | 0 |
| 0.0046452 | 0 |
| 0.00464765 | 0 |
| 0.0046501 | 0 |
| 0.00465255 | 0 |
| 0.004655 | 0 |
| 0.00465745 | 0 |
| 0.0046599 | 0 |
| 0.00466235 | 0 |
| 0.0046648 | 0 |
| 0.00466725 | 0 |
| 0.0046697 | 0 |
| 0.00467215 | 0 |
| 0.0046746 | 0 |
| 0.00467705 | 0 |
| 0.0046795 | 0 |
| 0.00468195 | 0 |
| 0.0046844 | 0 |
| 0.00468685 | 0 |
| 0.0046893 | 0 |
| 0.00469175 | 0 |
| 0.0046942 | 0 |
| 0.00469665 | 0 |
| 0.0046991 | 0 |
| 0.00470155 | 0 |
| 0.004704 | 0 |
| 0.00470645 | 0 |
| 0.0047089 | 0 |
| 0.00471135 | 0 |
| 0.0047138 | 0 |
| 0.00471625 | 0 |
| 0.0047187 | 0 |
| 0.00472115 | 0 |
| 0.0047236 | 0 |
| 0.00472605 | 0 |
| 0.0047285 | 0 |
| 0.00473095 | 0 |
| 0.0047334 | 0 |
| 0.00473585 | 0 |
| 0.0047383 | 0 |
| 0.00474075 | 0 |
| 0.0047432 | 0 |
| 0.00474565 | 0 |
| 0.0047481 | 0 |
| 0.00475055 | 0 |
| 0.004753 | 0 |
| 0.00475545 | 0 |
| 0.0047579 | 0 |
| 0.00476035 | 0 |
| 0.0047628 | 0 |
| 0.00476525 | 0 |
| 0.0047677 | 0 |
| 0.00477015 | 0 |
| 0.0047726 | 0 |
| 0.00477505 | 0 |
| 0.0047775 | 0 |
| 0.00477995 | 0 |
| 0.0047824 | 0 |
| 0.00478485 | 0 |
| 0.0047873 | 0 |
| 0.00478975 | 0 |
| 0.0047922 | 0 |
| 0.00479465 | 0 |
| 0.0047971 | 0 |
| 0.00479955 | 0 |
| 0.004802 | 0 |
| 0.00480445 | 0 |
| 0.0048069 | 0 |
| 0.00480935 | 0 |
| 0.0048118 | 0 |
| 0.00481425 | 0 |
| 0.0048167 | 0 |
| 0.00481915 | 0 |
| 0.0048216 | 0 |
| 0.00482405 | 0 |
| 0.0048265 | 0 |
| 0.00482895 | 0 |
| 0.0048314 | 0 |
| 0.00483385 | 0 |
| 0.0048363 | 0 |
| 0.00483875 | 0 |
| 0.0048412 | 0 |
| 0.00484365 | 0 |
| 0.0048461 | 0 |
| 0.00484855 | 0 |
| 0.004851 | 0 |
| 0.00485345 | 0 |
| 0.0048559 | 0 |
| 0.00485835 | 0 |
| 0.0048608 | 0 |
| 0.00486325 | 0 |
| 0.0048657 | 0 |
| 0.00486815 | 0 |
| 0.0048706 | 0 |
| 0.00487305 | 0 |
| 0.0048755 | 0 |
| 0.00487795 | 0 |
| 0.0048804 | 0 |
| 0.00488285 | 0 |
| 0.0048853 | 0 |
| 0.00488775 | 0 |
| 0.0048902 | 0 |
| 0.00489265 | 0 |
| 0.0048951 | 0 |
| 0.00489755 | 0 |
| 0.0049 | 0 |
| 0.00490245 | 0 |
| 0.0049049 | 0 |
| 0.00490735 | 0 |
| 0.0049098 | 0 |
| 0.00491225 | 0 |
| 0.0049147 | 0 |
| 0.00491715 | 0 |
| 0.0049196 | 0 |
| 0.00492205 | 0 |
| 0.0049245 | 0 |
| 0.00492695 | 0 |
| 0.0049294 | 0 |
| 0.00493185 | 0 |
| 0.0049343 | 0 |
| 0.00493675 | 0 |
| 0.0049392 | 0 |
| 0.00494165 | 0 |
| 0.0049441 | 0 |
| 0.00494655 | 0 |
| 0.004949 | 0 |
| 0.00495145 | 0 |
| 0.0049539 | 0 |
| 0.00495635 | 0 |
| 0.0049588 | 0 |
| 0.00496125 | 0 |
| 0.0049637 | 0 |
| 0.00496615 | 0 |
| 0.0049686 | 0 |
| 0.00497105 | 0 |
| 0.0049735 | 0 |
| 0.00497595 | 0 |
| 0.0049784 | 0 |
| 0.00498085 | 0 |
| 0.0049833 | 0 |
| 0.00498575 | 0 |
| 0.0049882 | 0 |
| 0.00499065 | 0 |
| 0.0049931 | 0 |
| 0.00499555 | 0 |